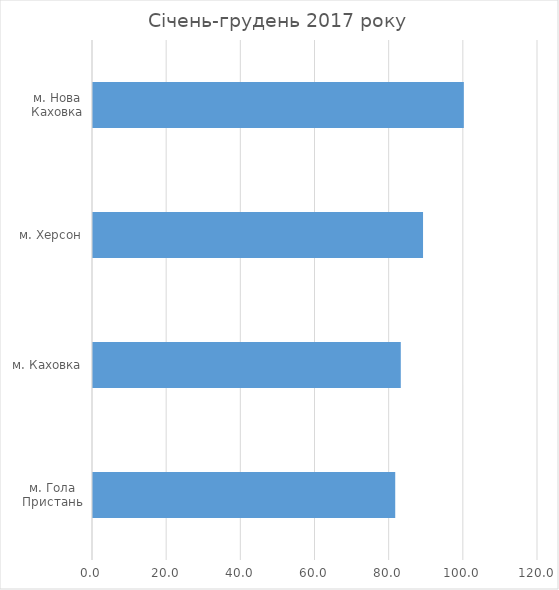
| Category | Series 0 |
|---|---|
| м. Гола Пристань | 81.5 |
| м. Каховка | 83 |
| м. Херсон | 89 |
| м. Нова Каховка | 100 |